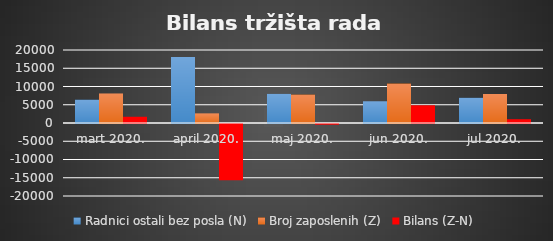
| Category | Radnici ostali bez posla (N) | Broj zaposlenih (Z) | Bilans (Z-N) |
|---|---|---|---|
| mart 2020. | 6384 | 8091 | 1707 |
| april 2020. | 18072 | 2639 | -15433 |
| maj 2020. | 7973 | 7778 | -195 |
| jun 2020. | 5956 | 10808 | 4852 |
| jul 2020. | 6902 | 7940 | 1038 |